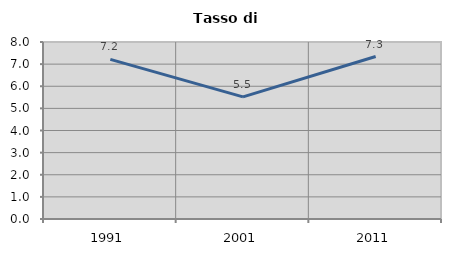
| Category | Tasso di disoccupazione   |
|---|---|
| 1991.0 | 7.213 |
| 2001.0 | 5.519 |
| 2011.0 | 7.343 |